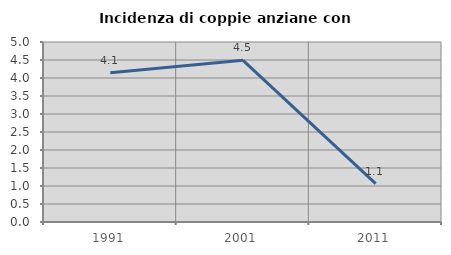
| Category | Incidenza di coppie anziane con figli |
|---|---|
| 1991.0 | 4.147 |
| 2001.0 | 4.49 |
| 2011.0 | 1.064 |